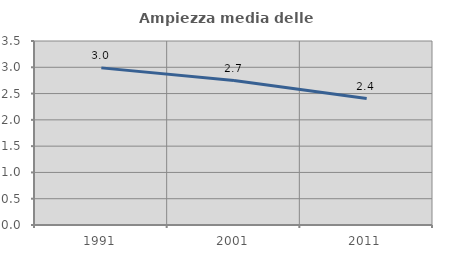
| Category | Ampiezza media delle famiglie |
|---|---|
| 1991.0 | 2.989 |
| 2001.0 | 2.748 |
| 2011.0 | 2.405 |